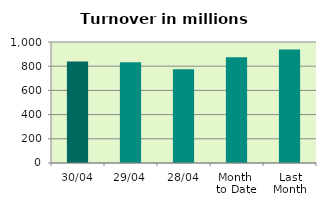
| Category | Series 0 |
|---|---|
| 30/04 | 839.726 |
| 29/04 | 832.652 |
| 28/04 | 775.342 |
| Month 
to Date | 873.677 |
| Last
Month | 937.305 |